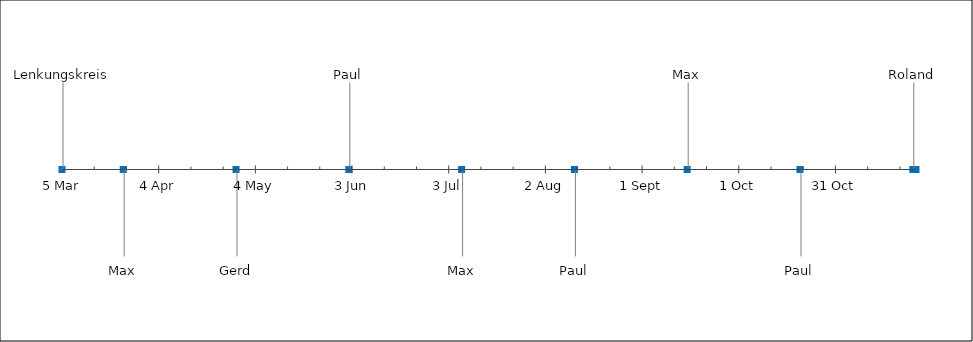
| Category | Position |
|---|---|
| Projektstart | 5 |
| Meilenstein 1 | -5 |
| Meilenstein 2 | -5 |
| Meilenstein 3 | 5 |
| Meilenstein 4 | -5 |
| Meilenstein 5 | -5 |
| Meilenstein 6 | 5 |
| Meilenstein 7 | -5 |
| Meilenstein 8 | 5 |
| Projektende | -5 |